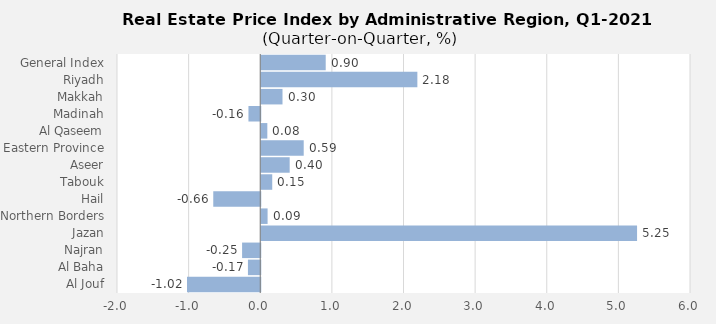
| Category | 2021 |
|---|---|
| General Index | 0.9 |
| Riyadh | 2.18 |
| Makkah | 0.297 |
| Madinah | -0.165 |
| Al Qaseem | 0.085 |
| Eastern Province | 0.593 |
| Aseer | 0.397 |
| Tabouk | 0.153 |
| Hail | -0.656 |
| Northern Borders | 0.089 |
| Jazan | 5.247 |
| Najran | -0.254 |
| Al Baha | -0.172 |
| Al Jouf | -1.023 |